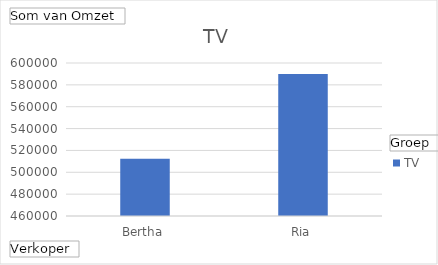
| Category | TV |
|---|---|
| Bertha | 512500 |
| Ria | 590000 |